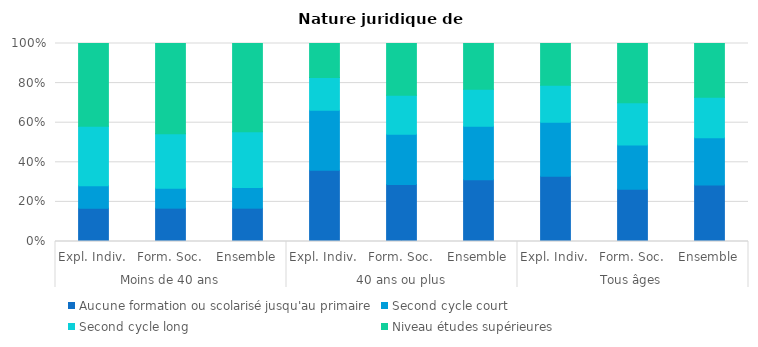
| Category | Aucune formation ou scolarisé jusqu'au primaire | Second cycle court | Second cycle long | Niveau études supérieures |
|---|---|---|---|---|
| 0 | 47 | 32 | 84 | 117 |
| 1 | 125 | 75 | 204 | 338 |
| 2 | 172 | 107 | 288 | 455 |
| 3 | 538 | 451 | 247 | 257 |
| 4 | 862 | 761 | 592 | 783 |
| 5 | 1400 | 1212 | 839 | 1040 |
| 6 | 585 | 483 | 331 | 374 |
| 7 | 987 | 836 | 796 | 1121 |
| 8 | 1572 | 1319 | 1127 | 1495 |